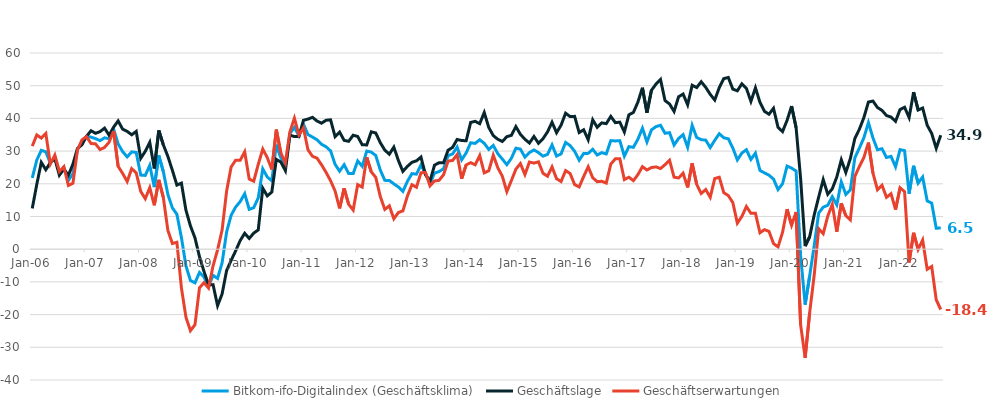
| Category | Bitkom-ifo-Digitalindex (Geschäftsklima) | Geschäftslage | Geschäftserwartungen |
|---|---|---|---|
| 2006-01-01 | 21.791 | 12.466 | 31.525 |
| 2006-02-01 | 27.253 | 19.815 | 34.943 |
| 2006-03-01 | 30.238 | 26.556 | 33.979 |
| 2006-04-01 | 29.78 | 24.306 | 35.386 |
| 2006-05-01 | 26.271 | 26.487 | 26.054 |
| 2006-06-01 | 28.214 | 27.652 | 28.778 |
| 2006-07-01 | 23.193 | 22.63 | 23.758 |
| 2006-08-01 | 24.863 | 24.489 | 25.238 |
| 2006-09-01 | 21.048 | 22.625 | 19.481 |
| 2006-10-01 | 23.086 | 26.043 | 20.167 |
| 2006-11-01 | 30.575 | 30.79 | 30.361 |
| 2006-12-01 | 32.679 | 31.925 | 33.435 |
| 2007-01-01 | 34.485 | 34.529 | 34.441 |
| 2007-02-01 | 34.271 | 36.23 | 32.327 |
| 2007-03-01 | 33.824 | 35.446 | 32.212 |
| 2007-04-01 | 33.193 | 35.957 | 30.462 |
| 2007-05-01 | 34.063 | 37.023 | 31.141 |
| 2007-06-01 | 33.781 | 34.851 | 32.716 |
| 2007-07-01 | 36.732 | 37.336 | 36.129 |
| 2007-08-01 | 32.18 | 39.232 | 25.335 |
| 2007-09-01 | 29.836 | 36.699 | 23.173 |
| 2007-10-01 | 28.232 | 36.021 | 20.699 |
| 2007-11-01 | 29.754 | 34.986 | 24.638 |
| 2007-12-01 | 29.589 | 36.016 | 23.336 |
| 2008-01-01 | 22.662 | 27.782 | 17.656 |
| 2008-02-01 | 22.569 | 29.924 | 15.449 |
| 2008-03-01 | 25.636 | 32.668 | 18.816 |
| 2008-04-01 | 18.985 | 24.691 | 13.423 |
| 2008-05-01 | 28.638 | 36.321 | 21.204 |
| 2008-06-01 | 23.722 | 31.927 | 15.807 |
| 2008-07-01 | 16.782 | 28.386 | 5.767 |
| 2008-08-01 | 12.644 | 24.132 | 1.745 |
| 2008-09-01 | 10.678 | 19.604 | 2.115 |
| 2008-10-01 | 3.563 | 20.207 | -11.823 |
| 2008-11-01 | -5.093 | 11.944 | -20.76 |
| 2008-12-01 | -9.573 | 7.113 | -24.914 |
| 2009-01-01 | -10.285 | 3.464 | -23.104 |
| 2009-02-01 | -7.111 | -2.316 | -11.79 |
| 2009-03-01 | -8.543 | -6.831 | -10.239 |
| 2009-04-01 | -11.409 | -10.953 | -11.863 |
| 2009-05-01 | -8 | -10.849 | -5.109 |
| 2009-06-01 | -8.926 | -17.27 | -0.201 |
| 2009-07-01 | -4.168 | -13.697 | 5.848 |
| 2009-08-01 | 5.257 | -6.529 | 17.762 |
| 2009-09-01 | 10.381 | -3.421 | 25.153 |
| 2009-10-01 | 12.897 | -0.515 | 27.211 |
| 2009-11-01 | 14.552 | 2.624 | 27.181 |
| 2009-12-01 | 16.963 | 4.866 | 29.775 |
| 2010-01-01 | 12.177 | 3.284 | 21.459 |
| 2010-02-01 | 12.707 | 4.922 | 20.787 |
| 2010-03-01 | 15.693 | 5.901 | 25.95 |
| 2010-04-01 | 24.559 | 18.663 | 30.614 |
| 2010-05-01 | 22.077 | 16.302 | 28.007 |
| 2010-06-01 | 20.91 | 17.481 | 24.394 |
| 2010-07-01 | 31.965 | 27.453 | 36.567 |
| 2010-08-01 | 28.039 | 26.649 | 29.437 |
| 2010-09-01 | 25.191 | 24.02 | 26.369 |
| 2010-10-01 | 35.361 | 34.852 | 35.872 |
| 2010-11-01 | 37.245 | 34.459 | 40.064 |
| 2010-12-01 | 34.686 | 34.431 | 34.941 |
| 2011-01-01 | 38.261 | 39.418 | 37.111 |
| 2011-02-01 | 35.053 | 39.786 | 30.414 |
| 2011-03-01 | 34.295 | 40.33 | 28.411 |
| 2011-04-01 | 33.452 | 39.198 | 27.844 |
| 2011-05-01 | 32.088 | 38.53 | 25.819 |
| 2011-06-01 | 31.332 | 39.435 | 23.503 |
| 2011-07-01 | 30.072 | 39.573 | 20.948 |
| 2011-08-01 | 25.955 | 34.429 | 17.787 |
| 2011-09-01 | 23.853 | 35.83 | 12.485 |
| 2011-10-01 | 25.838 | 33.286 | 18.628 |
| 2011-11-01 | 23.159 | 32.987 | 13.745 |
| 2011-12-01 | 23.123 | 34.857 | 11.975 |
| 2012-01-01 | 26.991 | 34.48 | 19.742 |
| 2012-02-01 | 25.376 | 31.939 | 18.999 |
| 2012-03-01 | 29.997 | 31.886 | 28.123 |
| 2012-04-01 | 29.701 | 35.895 | 23.669 |
| 2012-05-01 | 28.64 | 35.532 | 21.95 |
| 2012-06-01 | 24.208 | 32.581 | 16.136 |
| 2012-07-01 | 21.05 | 30.303 | 12.168 |
| 2012-08-01 | 21.015 | 29.048 | 13.264 |
| 2012-09-01 | 19.987 | 31.217 | 9.302 |
| 2012-10-01 | 19.034 | 27.147 | 11.211 |
| 2012-11-01 | 17.674 | 23.796 | 11.72 |
| 2012-12-01 | 20.743 | 25.328 | 16.251 |
| 2013-01-01 | 23.115 | 26.562 | 19.721 |
| 2013-02-01 | 22.953 | 27.019 | 18.96 |
| 2013-03-01 | 25.75 | 28.169 | 23.357 |
| 2013-04-01 | 23.11 | 22.761 | 23.46 |
| 2013-05-01 | 20.099 | 20.824 | 19.376 |
| 2013-06-01 | 23.272 | 25.696 | 20.875 |
| 2013-07-01 | 23.73 | 26.445 | 21.048 |
| 2013-08-01 | 24.605 | 26.454 | 22.772 |
| 2013-09-01 | 28.611 | 30.268 | 26.965 |
| 2013-10-01 | 29.13 | 31.144 | 27.134 |
| 2013-11-01 | 31.226 | 33.555 | 28.92 |
| 2013-12-01 | 27.325 | 33.241 | 21.558 |
| 2014-01-01 | 29.438 | 33.161 | 25.775 |
| 2014-02-01 | 32.537 | 38.774 | 26.462 |
| 2014-03-01 | 32.357 | 39.104 | 25.799 |
| 2014-04-01 | 33.464 | 38.386 | 28.644 |
| 2014-05-01 | 32.39 | 41.797 | 23.349 |
| 2014-06-01 | 30.509 | 37.231 | 23.978 |
| 2014-07-01 | 31.734 | 34.738 | 28.769 |
| 2014-08-01 | 29.22 | 33.616 | 24.906 |
| 2014-09-01 | 27.566 | 32.937 | 22.318 |
| 2014-10-01 | 25.848 | 34.41 | 17.598 |
| 2014-11-01 | 27.795 | 34.825 | 20.975 |
| 2014-12-01 | 30.884 | 37.482 | 24.468 |
| 2015-01-01 | 30.616 | 35.134 | 26.184 |
| 2015-02-01 | 28.159 | 33.62 | 22.826 |
| 2015-03-01 | 29.547 | 32.469 | 26.663 |
| 2015-04-01 | 30.366 | 34.478 | 26.326 |
| 2015-05-01 | 29.537 | 32.383 | 26.725 |
| 2015-06-01 | 28.454 | 33.806 | 23.224 |
| 2015-07-01 | 28.992 | 35.874 | 22.311 |
| 2015-08-01 | 31.893 | 38.823 | 25.164 |
| 2015-09-01 | 28.483 | 35.628 | 21.555 |
| 2015-10-01 | 29.151 | 37.927 | 20.697 |
| 2015-11-01 | 32.654 | 41.596 | 24.042 |
| 2015-12-01 | 31.684 | 40.55 | 23.145 |
| 2016-01-01 | 29.949 | 40.622 | 19.749 |
| 2016-02-01 | 27.207 | 35.679 | 19.04 |
| 2016-03-01 | 29.268 | 36.524 | 22.235 |
| 2016-04-01 | 29.305 | 33.468 | 25.215 |
| 2016-05-01 | 30.543 | 39.573 | 21.855 |
| 2016-06-01 | 28.805 | 37.267 | 20.646 |
| 2016-07-01 | 29.528 | 38.632 | 20.771 |
| 2016-08-01 | 29.13 | 38.398 | 20.223 |
| 2016-09-01 | 33.2 | 40.607 | 26.02 |
| 2016-10-01 | 33.108 | 38.705 | 27.643 |
| 2016-11-01 | 33.183 | 38.842 | 27.657 |
| 2016-12-01 | 28.443 | 35.829 | 21.288 |
| 2017-01-01 | 31.36 | 41.092 | 22.02 |
| 2017-02-01 | 31.158 | 41.827 | 20.96 |
| 2017-03-01 | 33.647 | 45 | 22.819 |
| 2017-04-01 | 37.005 | 49.374 | 25.248 |
| 2017-05-01 | 32.802 | 41.711 | 24.222 |
| 2017-06-01 | 36.494 | 48.603 | 24.975 |
| 2017-07-01 | 37.496 | 50.49 | 25.175 |
| 2017-08-01 | 37.901 | 51.923 | 24.661 |
| 2017-09-01 | 35.447 | 45.446 | 25.855 |
| 2017-10-01 | 35.646 | 44.416 | 27.192 |
| 2017-11-01 | 31.859 | 42.136 | 22.018 |
| 2017-12-01 | 33.872 | 46.615 | 21.787 |
| 2018-01-01 | 35.035 | 47.439 | 23.252 |
| 2018-02-01 | 31.181 | 44.164 | 18.889 |
| 2018-03-01 | 37.882 | 50.121 | 26.242 |
| 2018-04-01 | 34.168 | 49.429 | 19.84 |
| 2018-05-01 | 33.5 | 51.212 | 17.037 |
| 2018-06-01 | 33.351 | 49.503 | 18.245 |
| 2018-07-01 | 31.08 | 47.355 | 15.876 |
| 2018-08-01 | 33.31 | 45.624 | 21.613 |
| 2018-09-01 | 35.312 | 49.408 | 22.012 |
| 2018-10-01 | 34.079 | 52.168 | 17.287 |
| 2018-11-01 | 33.759 | 52.514 | 16.398 |
| 2018-12-01 | 30.953 | 48.95 | 14.258 |
| 2019-01-01 | 27.311 | 48.44 | 7.979 |
| 2019-02-01 | 29.411 | 50.592 | 10.02 |
| 2019-03-01 | 30.416 | 49.198 | 13.049 |
| 2019-04-01 | 27.447 | 45.212 | 10.969 |
| 2019-05-01 | 29.385 | 49.376 | 10.996 |
| 2019-06-01 | 24.082 | 44.916 | 5.02 |
| 2019-07-01 | 23.337 | 42.161 | 5.977 |
| 2019-08-01 | 22.644 | 41.275 | 5.453 |
| 2019-09-01 | 21.445 | 43.091 | 1.727 |
| 2019-10-01 | 18.224 | 37.278 | 0.701 |
| 2019-11-01 | 20.026 | 35.96 | 5.168 |
| 2019-12-01 | 25.422 | 39.402 | 12.259 |
| 2020-01-01 | 24.801 | 43.763 | 7.314 |
| 2020-02-01 | 23.894 | 37.167 | 11.365 |
| 2020-03-01 | -2.042 | 21.585 | -23.15 |
| 2020-04-01 | -16.934 | 0.942 | -33.219 |
| 2020-05-01 | -8.15 | 3.815 | -19.412 |
| 2020-06-01 | 1.025 | 10.45 | -7.979 |
| 2020-07-01 | 11.066 | 15.978 | 6.265 |
| 2020-08-01 | 12.854 | 21.276 | 4.752 |
| 2020-09-01 | 13.425 | 16.804 | 10.099 |
| 2020-10-01 | 16.068 | 18.452 | 13.711 |
| 2020-11-01 | 13.555 | 22.078 | 5.359 |
| 2020-12-01 | 20.587 | 27.334 | 14.04 |
| 2021-01-01 | 16.753 | 23.457 | 10.25 |
| 2021-02-01 | 18.138 | 27.703 | 8.975 |
| 2021-03-01 | 27.985 | 33.884 | 22.235 |
| 2021-04-01 | 30.925 | 36.692 | 25.299 |
| 2021-05-01 | 34.089 | 40.267 | 28.07 |
| 2021-06-01 | 38.725 | 45.003 | 32.608 |
| 2021-07-01 | 34.025 | 45.304 | 23.264 |
| 2021-08-01 | 30.415 | 43.329 | 18.186 |
| 2021-09-01 | 30.724 | 42.449 | 19.566 |
| 2021-10-01 | 28.033 | 40.87 | 15.879 |
| 2021-11-01 | 28.391 | 40.42 | 16.964 |
| 2021-12-01 | 25.206 | 39.112 | 12.108 |
| 2022-01-01 | 30.452 | 42.724 | 18.8 |
| 2022-02-01 | 30.142 | 43.417 | 17.591 |
| 2022-03-01 | 16.981 | 40.259 | -4.042 |
| 2022-04-01 | 25.503 | 48.033 | 5.019 |
| 2022-05-01 | 20.211 | 42.562 | -0.081 |
| 2022-06-01 | 22.06 | 43.17 | 2.782 |
| 2022-07-01 | 14.775 | 37.922 | -6.121 |
| 2022-08-01 | 14.101 | 35.383 | -5.256 |
| 2022-09-01 | 6.406 | 30.861 | -15.458 |
| 2022-10-01 | 6.497 | 34.859 | -18.441 |